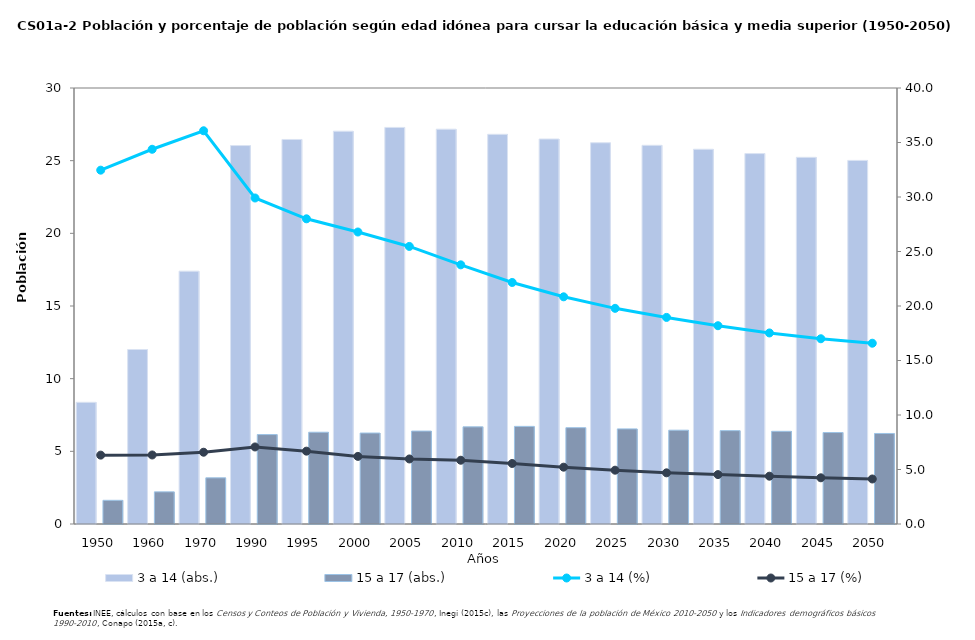
| Category | 3 a 14 (abs.) | 15 a 17 (abs.) |
|---|---|---|
| 1950.0 | 8372114.994 | 1629612.369 |
| 1960.0 | 12006265.802 | 2211725.833 |
| 1970.0 | 17398387.694 | 3175143.884 |
| 1990.0 | 26040145 | 6153746 |
| 1995.0 | 26456903 | 6314609 |
| 2000.0 | 27028181 | 6259145 |
| 2005.0 | 27285586 | 6393776 |
| 2010.0 | 27165510.126 | 6683126.813 |
| 2015.0 | 26813005.381 | 6717054.047 |
| 2020.0 | 26489704.553 | 6625988.218 |
| 2025.0 | 26232070.758 | 6544527.612 |
| 2030.0 | 26056198.794 | 6454517.791 |
| 2035.0 | 25785278.389 | 6424001.186 |
| 2040.0 | 25485834.773 | 6377097.397 |
| 2045.0 | 25228986.637 | 6292935.238 |
| 2050.0 | 25015869.345 | 6228492.567 |